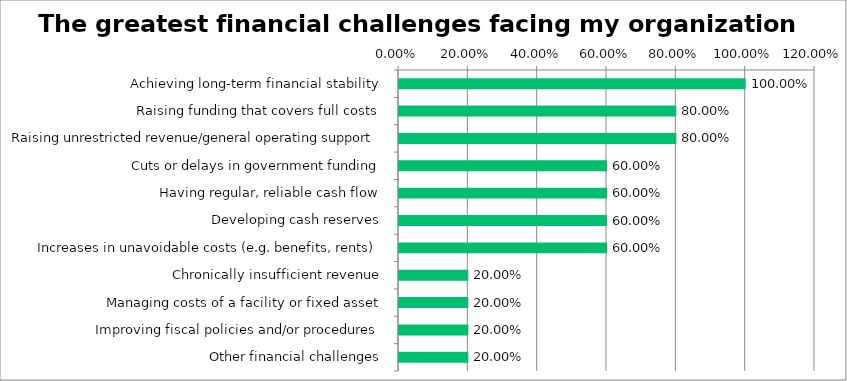
| Category | Responses |
|---|---|
| Achieving long-term financial stability | 1 |
| Raising funding that covers full costs | 0.8 |
| Raising unrestricted revenue/general operating support | 0.8 |
| Cuts or delays in government funding | 0.6 |
| Having regular, reliable cash flow | 0.6 |
| Developing cash reserves | 0.6 |
| Increases in unavoidable costs (e.g. benefits, rents) | 0.6 |
| Chronically insufficient revenue | 0.2 |
| Managing costs of a facility or fixed asset | 0.2 |
| Improving fiscal policies and/or procedures | 0.2 |
| Other financial challenges | 0.2 |